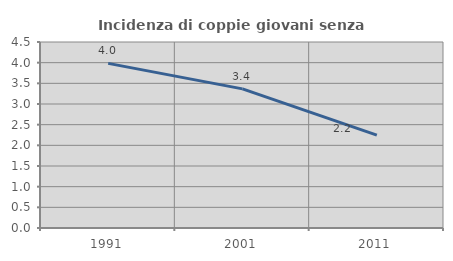
| Category | Incidenza di coppie giovani senza figli |
|---|---|
| 1991.0 | 3.982 |
| 2001.0 | 3.366 |
| 2011.0 | 2.247 |